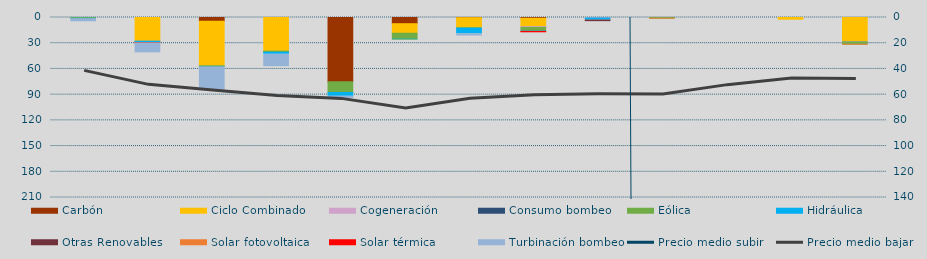
| Category | Carbón | Ciclo Combinado | Cogeneración | Consumo bombeo | Eólica | Hidráulica | Otras Renovables | Solar fotovoltaica | Solar térmica | Turbinación bombeo |
|---|---|---|---|---|---|---|---|---|---|---|
| 0 | 0 | 0 | 0 |  | 855.2 | 637 | 0 | 0 | 0 | 3504.5 |
| 1 | 0 | 27663.3 | 74 |  | 18.7 | 1645.3 | 0 | 8 | 221.4 | 11565.1 |
| 2 | 4460 | 52106 | 0 |  | 368.1 | 764.8 | 0 | 0 | 0 | 27154.6 |
| 3 | 0 | 39236 | 0 |  | 1278 | 2424.3 | 0 | 0 | 0 | 14379.6 |
| 4 | 74968 | 0 | 0 |  | 12523.3 | 4431 | 0 | 0 | 0 | 2491.6 |
| 5 | 7230 | 11115 | 0 |  | 6943.7 | 542.5 | 0 | 0 | 0 | 0 |
| 6 | 225 | 11910 | 0 |  | 141.3 | 6802.6 | 0 | 0 | 0 | 2517.5 |
| 7 | 872 | 9746.8 | 968.1 |  | 3997.8 | 598.2 | 0 | 46.7 | 458.7 | 0 |
| 8 | 0 | 0 | 524.1 |  | 0 | 2473.2 | 672 | 0 | 0 | 0 |
| 9 | 0 | 0 | 0 |  | 757.3 | 0 | 0 | 12.2 | 0 | 0 |
| 10 | 0 | 0 | 0 |  | 0 | 0 | 0 | 0 | 0 | 0 |
| 11 | 0 | 2002 | 0 |  | 0 | 0 | 0 | 0 | 0 | 0 |
| 12 | 0 | 28154.5 | 304 |  | 2598.1 | 70.2 | 0 | 87.1 | 0 | 0 |